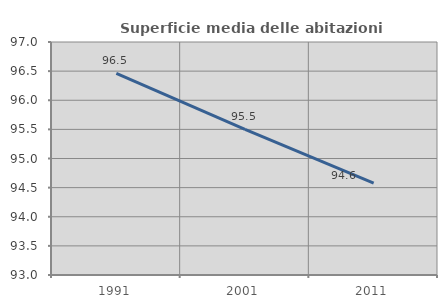
| Category | Superficie media delle abitazioni occupate |
|---|---|
| 1991.0 | 96.461 |
| 2001.0 | 95.5 |
| 2011.0 | 94.579 |